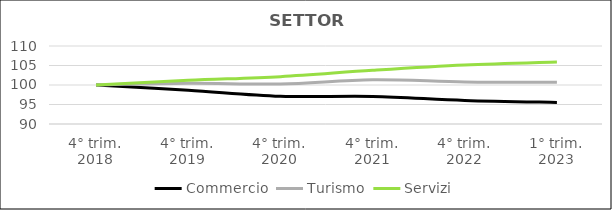
| Category | Commercio | Turismo | Servizi |
|---|---|---|---|
| 4° trim.
2018 | 100 | 100 | 100 |
| 4° trim.
2019 | 98.666 | 100.436 | 101.191 |
| 4° trim.
2020 | 97.118 | 100.272 | 102.135 |
| 4° trim.
2021 | 97.071 | 101.334 | 103.756 |
| 4° trim.
2022 | 96.05 | 100.79 | 105.12 |
| 1° trim.
2023 | 95.527 | 100.708 | 105.929 |